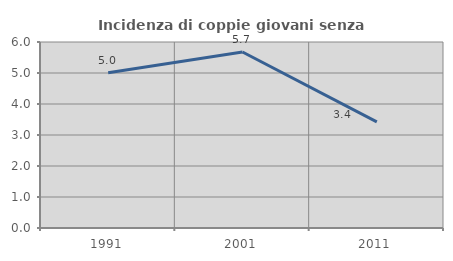
| Category | Incidenza di coppie giovani senza figli |
|---|---|
| 1991.0 | 5.007 |
| 2001.0 | 5.678 |
| 2011.0 | 3.421 |